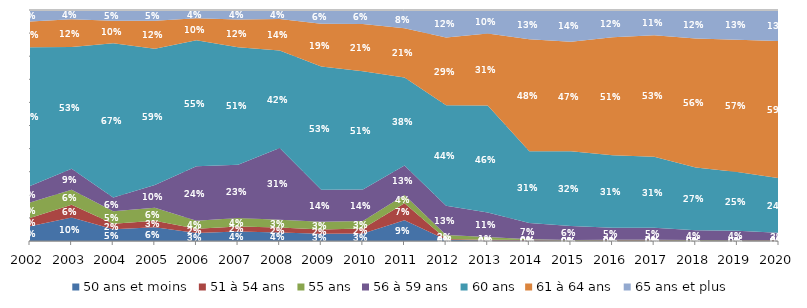
| Category | 50 ans et moins | 51 à 54 ans | 55 ans | 56 à 59 ans | 60 ans | 61 à 64 ans | 65 ans et plus |
|---|---|---|---|---|---|---|---|
| 2002.0 | 0.064 | 0.036 | 0.067 | 0.072 | 0.601 | 0.112 | 0.049 |
| 2003.0 | 0.101 | 0.056 | 0.065 | 0.091 | 0.527 | 0.12 | 0.04 |
| 2004.0 | 0.051 | 0.024 | 0.054 | 0.06 | 0.668 | 0.097 | 0.047 |
| 2005.0 | 0.06 | 0.028 | 0.056 | 0.098 | 0.59 | 0.122 | 0.046 |
| 2006.0 | 0.034 | 0.018 | 0.035 | 0.236 | 0.545 | 0.096 | 0.035 |
| 2007.0 | 0.041 | 0.022 | 0.037 | 0.231 | 0.509 | 0.12 | 0.041 |
| 2008.0 | 0.036 | 0.022 | 0.034 | 0.311 | 0.422 | 0.136 | 0.039 |
| 2009.0 | 0.031 | 0.018 | 0.034 | 0.139 | 0.534 | 0.185 | 0.059 |
| 2010.0 | 0.033 | 0.022 | 0.032 | 0.137 | 0.511 | 0.205 | 0.06 |
| 2011.0 | 0.09 | 0.073 | 0.035 | 0.129 | 0.381 | 0.213 | 0.079 |
| 2012.0 | 0.005 | 0.004 | 0.016 | 0.127 | 0.435 | 0.293 | 0.119 |
| 2013.0 | 0.003 | 0.002 | 0.012 | 0.106 | 0.463 | 0.312 | 0.102 |
| 2014.0 | 0.002 | 0.003 | 0.003 | 0.07 | 0.311 | 0.485 | 0.127 |
| 2015.0 | 0.001 | 0.001 | 0.002 | 0.06 | 0.324 | 0.474 | 0.137 |
| 2016.0 | 0.001 | 0.002 | 0.002 | 0.051 | 0.315 | 0.511 | 0.118 |
| 2017.0 | 0.001 | 0.003 | 0.002 | 0.052 | 0.307 | 0.527 | 0.109 |
| 2018.0 | 0.001 | 0.002 | 0.002 | 0.043 | 0.272 | 0.558 | 0.123 |
| 2019.0 | 0.001 | 0.002 | 0.001 | 0.04 | 0.254 | 0.573 | 0.128 |
| 2020.0 | 0.001 | 0.001 | 0.001 | 0.033 | 0.236 | 0.593 | 0.135 |